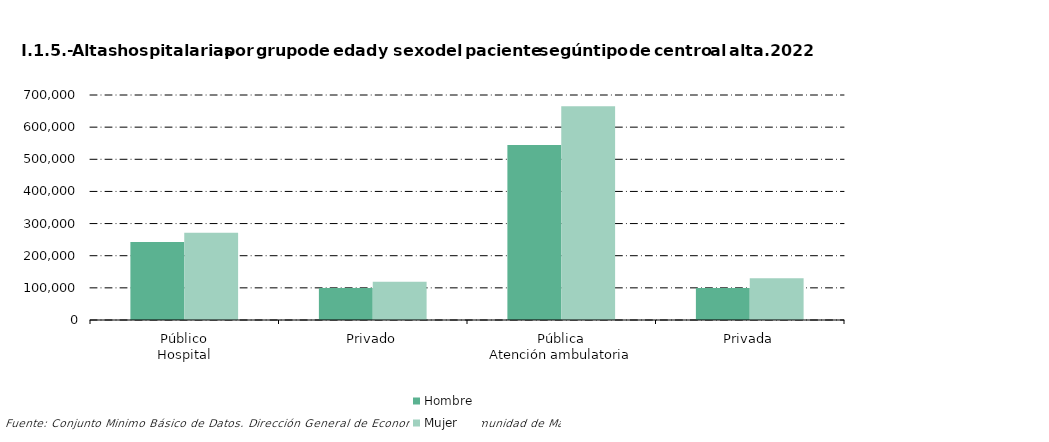
| Category |     Hombre |     Mujer |
|---|---|---|
| 0 | 242771 | 271093 |
| 1 | 99585 | 119362 |
| 2 | 544812 | 665286 |
| 3 | 99575 | 130105 |